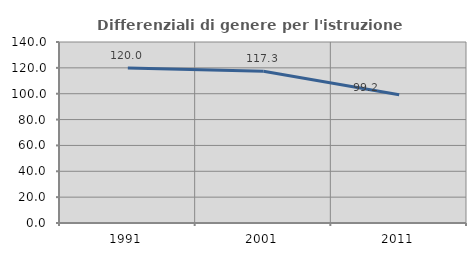
| Category | Differenziali di genere per l'istruzione superiore |
|---|---|
| 1991.0 | 119.974 |
| 2001.0 | 117.313 |
| 2011.0 | 99.246 |